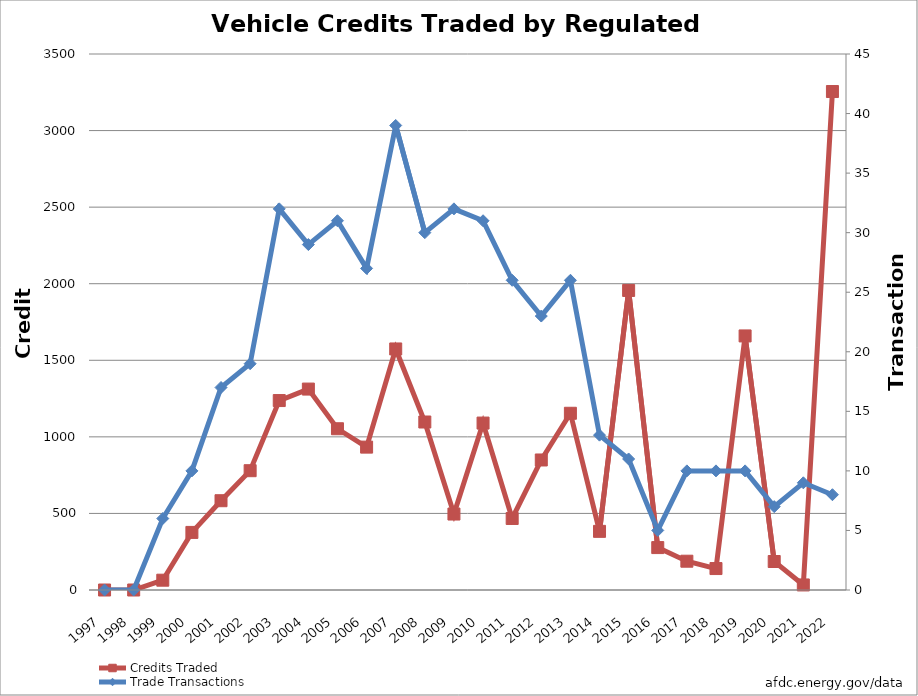
| Category | Credits Traded |
|---|---|
| 1997.0 | 0 |
| 1998.0 | 0 |
| 1999.0 | 64 |
| 2000.0 | 376 |
| 2001.0 | 583 |
| 2002.0 | 779 |
| 2003.0 | 1237 |
| 2004.0 | 1312 |
| 2005.0 | 1053 |
| 2006.0 | 933 |
| 2007.0 | 1574 |
| 2008.0 | 1097 |
| 2009.0 | 496 |
| 2010.0 | 1090 |
| 2011.0 | 467 |
| 2012.0 | 849 |
| 2013.0 | 1154 |
| 2014.0 | 383 |
| 2015.0 | 1956 |
| 2016.0 | 277 |
| 2017.0 | 188 |
| 2018.0 | 140 |
| 2019.0 | 1659 |
| 2020.0 | 186 |
| 2021.0 | 33 |
| 2022.0 | 3255 |